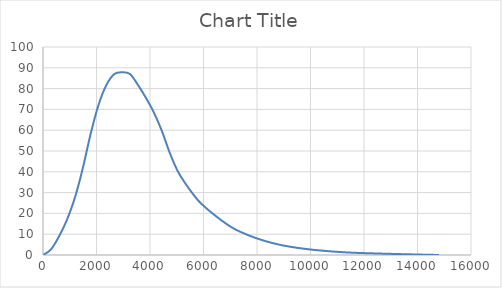
| Category | Series 0 |
|---|---|
| 0.0 | 0 |
| 296.0525934067135 | 2.635 |
| 592.105186813427 | 8.784 |
| 888.1577802201405 | 16.69 |
| 1184.210373626854 | 27.23 |
| 1480.2629670335675 | 41.285 |
| 1776.315560440281 | 57.974 |
| 2072.3681538469946 | 72.029 |
| 2368.420747253708 | 81.691 |
| 2664.4733406604214 | 86.962 |
| 2960.525934067135 | 87.84 |
| 3256.5785274738487 | 86.962 |
| 3552.631120880562 | 81.691 |
| 3848.6837142872755 | 75.542 |
| 4144.736307693989 | 68.515 |
| 4440.788901100703 | 59.731 |
| 4736.841494507416 | 49.19 |
| 5032.894087914129 | 40.406 |
| 5328.946681320843 | 34.258 |
| 5624.999274727556 | 28.987 |
| 5921.05186813427 | 24.595 |
| 6513.157054947697 | 18.183 |
| 7105.262241761124 | 12.912 |
| 7697.367428574551 | 9.399 |
| 8289.472615387978 | 6.764 |
| 8881.577802201406 | 4.831 |
| 9473.682989014833 | 3.514 |
| 10065.788175828258 | 2.547 |
| 10657.893362641686 | 1.845 |
| 11249.998549455113 | 1.318 |
| 11842.10373626854 | 0.966 |
| 13322.366703302108 | 0.439 |
| 14802.629670335675 | 0 |